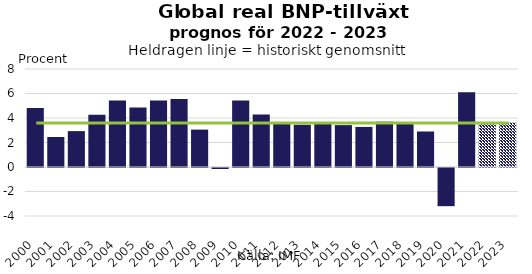
| Category | BNP |
|---|---|
| 2000.0 | 4.807 |
| 2001.0 | 2.447 |
| 2002.0 | 2.928 |
| 2003.0 | 4.267 |
| 2004.0 | 5.421 |
| 2005.0 | 4.867 |
| 2006.0 | 5.427 |
| 2007.0 | 5.561 |
| 2008.0 | 3.054 |
| 2009.0 | -0.084 |
| 2010.0 | 5.431 |
| 2011.0 | 4.288 |
| 2012.0 | 3.6 |
| 2013.0 | 3.447 |
| 2014.0 | 3.513 |
| 2015.0 | 3.418 |
| 2016.0 | 3.271 |
| 2017.0 | 3.7 |
| 2018.0 | 3.569 |
| 2019.0 | 2.9 |
| 2020.0 | -3.116 |
| 2021.0 | 6.1 |
| 2022.0 | 3.6 |
| 2023.0 | 3.618 |